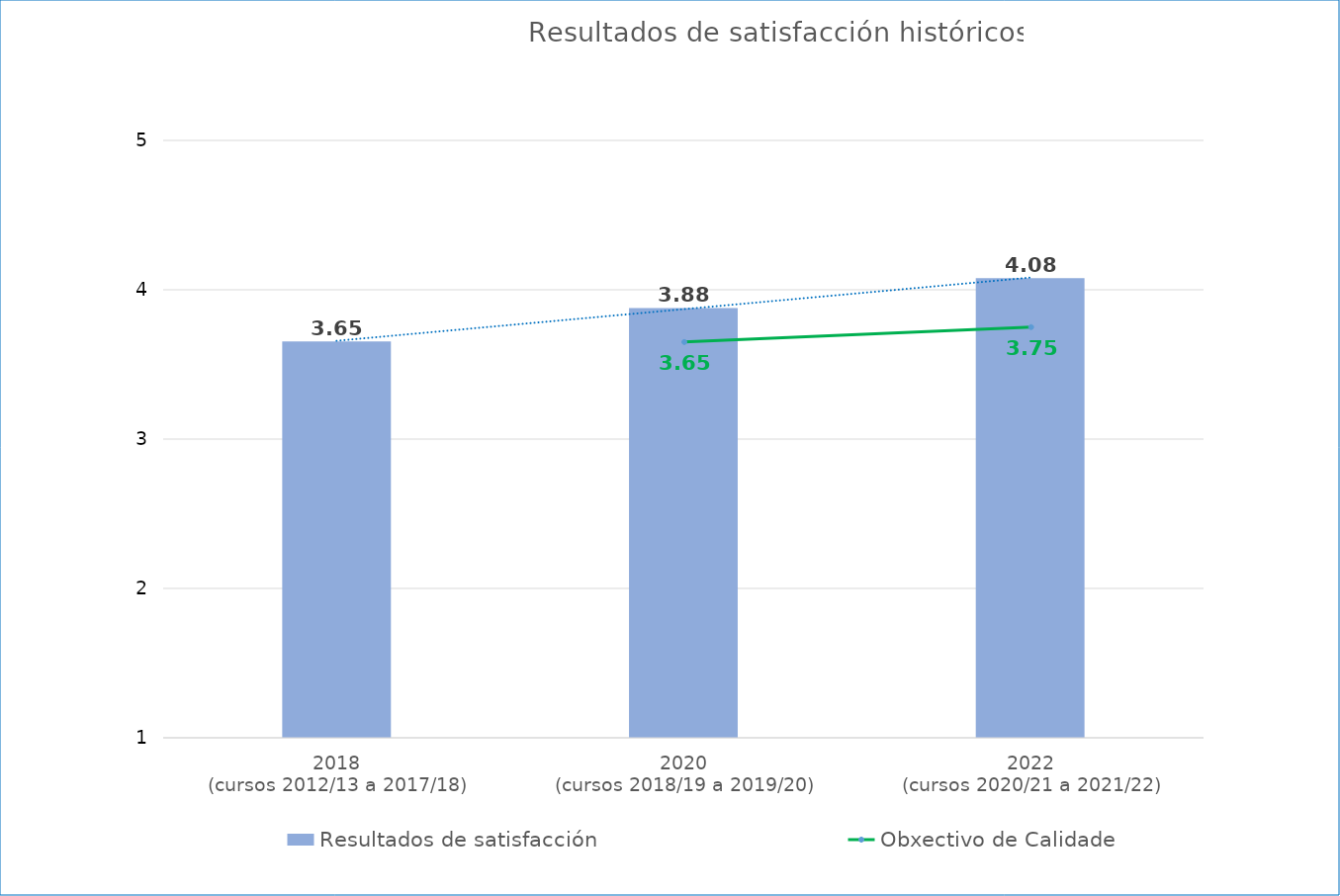
| Category | Resultados de satisfacción |
|---|---|
| 2018
(cursos 2012/13 a 2017/18) | 3.654 |
| 2020
(cursos 2018/19 a 2019/20) | 3.878 |
| 2022
(cursos 2020/21 a 2021/22) | 4.077 |